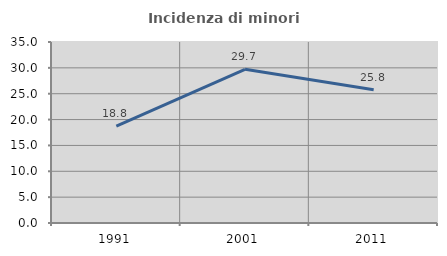
| Category | Incidenza di minori stranieri |
|---|---|
| 1991.0 | 18.75 |
| 2001.0 | 29.71 |
| 2011.0 | 25.776 |